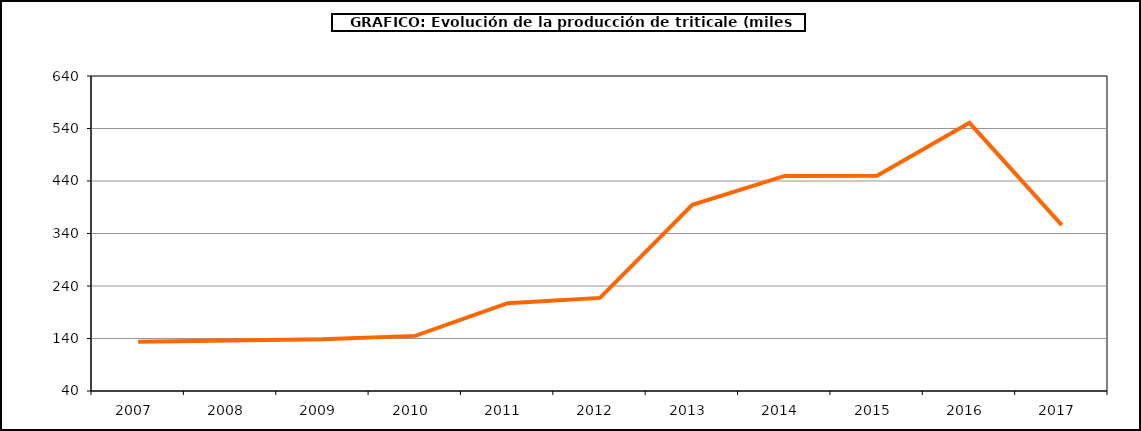
| Category | Producción |
|---|---|
| 2007.0 | 133.75 |
| 2008.0 | 136.246 |
| 2009.0 | 138.491 |
| 2010.0 | 144.991 |
| 2011.0 | 207.218 |
| 2012.0 | 217.311 |
| 2013.0 | 394.752 |
| 2014.0 | 449.675 |
| 2015.0 | 449.983 |
| 2016.0 | 550.838 |
| 2017.0 | 355.84 |